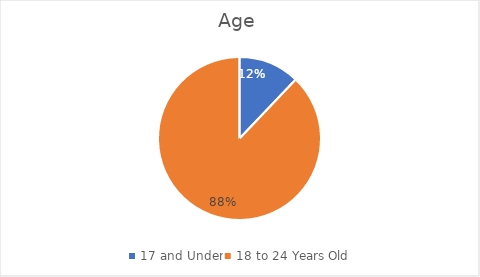
| Category | Series 0 |
|---|---|
| 17 and Under | 34 |
| 18 to 24 Years Old | 247 |